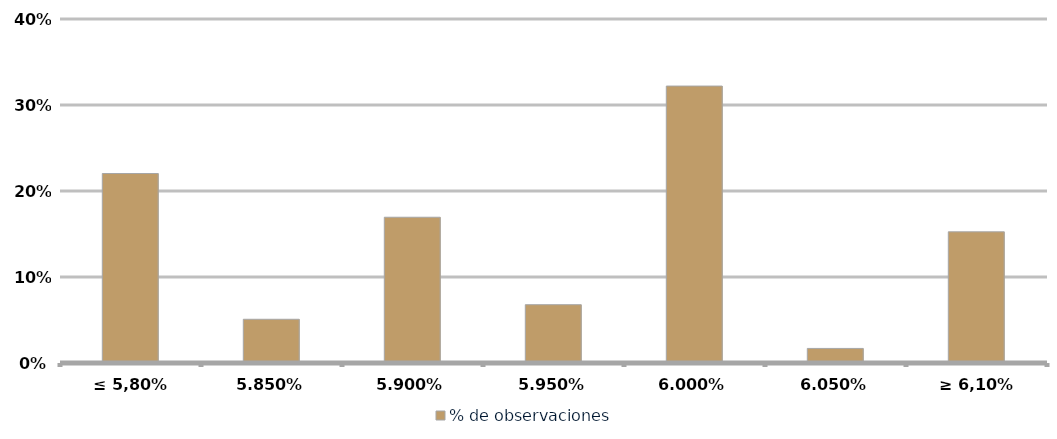
| Category | % de observaciones  |
|---|---|
| ≤ 5,80% | 0.22 |
| 5.85% | 0.051 |
| 5.90% | 0.169 |
| 5.95% | 0.068 |
| 6.00% | 0.322 |
| 6.05% | 0.017 |
| ≥ 6,10% | 0.153 |